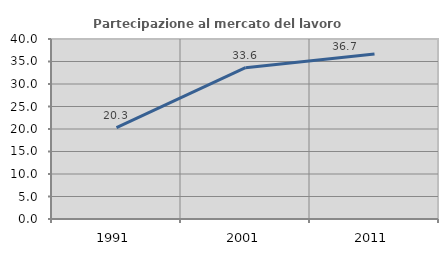
| Category | Partecipazione al mercato del lavoro  femminile |
|---|---|
| 1991.0 | 20.297 |
| 2001.0 | 33.636 |
| 2011.0 | 36.681 |